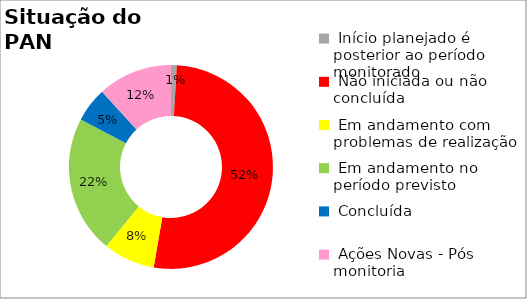
| Category | Series 0 |
|---|---|
|  Início planejado é posterior ao período monitorado | 0.009 |
|  Não iniciada ou não concluída | 0.518 |
|  Em andamento com problemas de realização | 0.082 |
|  Em andamento no período previsto  | 0.218 |
|  Concluída | 0.055 |
|  Ações Novas - Pós monitoria | 0.118 |